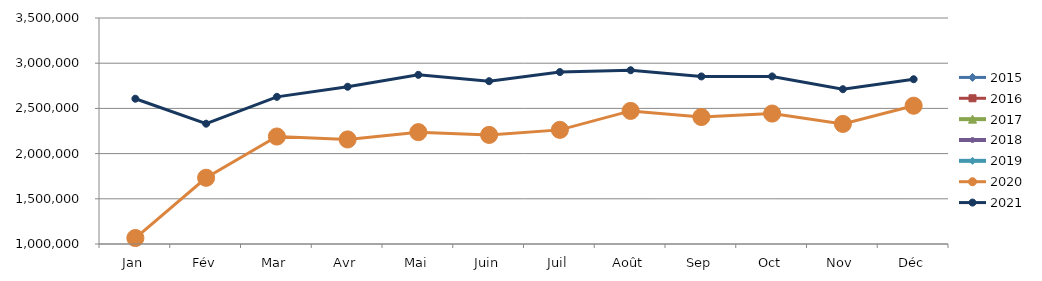
| Category | 2015 | 2016 | 2017 | 2018 | 2019 | 2020 | 2021 |
|---|---|---|---|---|---|---|---|
| Jan | 0 | 0 | 0 | 0 | 0 | 1065914.395 | 2606997.263 |
| Fév | 0 | 0 | 0 | 0 | 0 | 1732446.596 | 2330972.971 |
| Mar | 0 | 0 | 0 | 0 | 0 | 2188822.187 | 2627784.258 |
| Avr | 0 | 0 | 0 | 0 | 0 | 2156692.388 | 2739322.316 |
| Mai | 0 | 0 | 0 | 0 | 0 | 2237302.96 | 2871301.078 |
| Juin | 0 | 0 | 0 | 0 | 0 | 2206664.409 | 2800973.605 |
| Juil | 0 | 0 | 0 | 0 | 0 | 2262469.236 | 2901835.671 |
| Août | 0 | 0 | 0 | 0 | 0 | 2472399.146 | 2922140.191 |
| Sep | 0 | 0 | 0 | 0 | 0 | 2404432.621 | 2853410.497 |
| Oct | 0 | 0 | 0 | 0 | 0 | 2442779.508 | 2853580.553 |
| Nov | 0 | 0 | 0 | 0 | 0 | 2328229.47 | 2712524.771 |
| Déc | 0 | 0 | 0 | 0 | 0 | 2529675.124 | 2822679.51 |